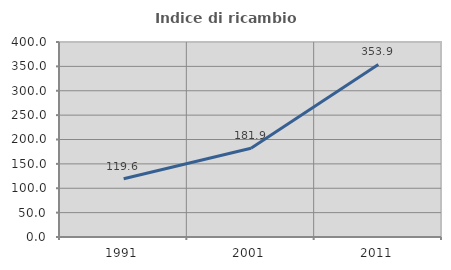
| Category | Indice di ricambio occupazionale  |
|---|---|
| 1991.0 | 119.643 |
| 2001.0 | 181.915 |
| 2011.0 | 353.947 |